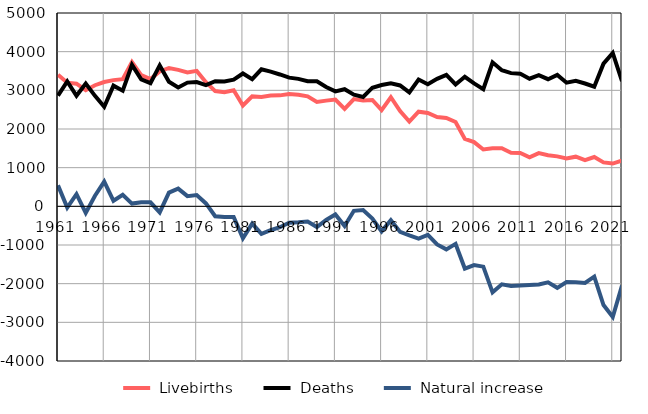
| Category |  Livebirths |  Deaths |  Natural increase |
|---|---|---|---|
| 1961.0 | 3402 | 2860 | 542 |
| 1962.0 | 3198 | 3229 | -31 |
| 1963.0 | 3173 | 2860 | 313 |
| 1964.0 | 3004 | 3173 | -169 |
| 1965.0 | 3132 | 2857 | 275 |
| 1966.0 | 3215 | 2575 | 640 |
| 1967.0 | 3264 | 3121 | 143 |
| 1968.0 | 3289 | 2992 | 297 |
| 1969.0 | 3730 | 3659 | 71 |
| 1970.0 | 3394 | 3286 | 108 |
| 1971.0 | 3290 | 3187 | 103 |
| 1972.0 | 3489 | 3645 | -156 |
| 1973.0 | 3578 | 3222 | 356 |
| 1974.0 | 3529 | 3072 | 457 |
| 1975.0 | 3464 | 3200 | 264 |
| 1976.0 | 3503 | 3213 | 290 |
| 1977.0 | 3211 | 3136 | 75 |
| 1978.0 | 2980 | 3236 | -256 |
| 1979.0 | 2953 | 3229 | -276 |
| 1980.0 | 3002 | 3276 | -274 |
| 1981.0 | 2609 | 3436 | -827 |
| 1982.0 | 2843 | 3289 | -446 |
| 1983.0 | 2830 | 3544 | -714 |
| 1984.0 | 2866 | 3484 | -618 |
| 1985.0 | 2870 | 3410 | -540 |
| 1986.0 | 2905 | 3328 | -423 |
| 1987.0 | 2885 | 3296 | -411 |
| 1988.0 | 2846 | 3237 | -391 |
| 1989.0 | 2698 | 3233 | -535 |
| 1990.0 | 2734 | 3085 | -351 |
| 1991.0 | 2762 | 2972 | -210 |
| 1992.0 | 2521 | 3028 | -507 |
| 1993.0 | 2774 | 2889 | -115 |
| 1994.0 | 2735 | 2829 | -94 |
| 1995.0 | 2750 | 3068 | -318 |
| 1996.0 | 2489 | 3137 | -648 |
| 1997.0 | 2822 | 3180 | -358 |
| 1998.0 | 2464 | 3126 | -662 |
| 1999.0 | 2193 | 2945 | -752 |
| 2000.0 | 2447 | 3280 | -833 |
| 2001.0 | 2416 | 3156 | -740 |
| 2002.0 | 2311 | 3296 | -985 |
| 2003.0 | 2287 | 3400 | -1113 |
| 2004.0 | 2181 | 3152 | -971 |
| 2005.0 | 1742 | 3351 | -1609 |
| 2006.0 | 1660 | 3178 | -1518 |
| 2007.0 | 1470 | 3030 | -1560 |
| 2008.0 | 1499 | 3724 | -2225 |
| 2009.0 | 1501 | 3519 | -2018 |
| 2010.0 | 1385 | 3445 | -2060 |
| 2011.0 | 1378 | 3428 | -2050 |
| 2012.0 | 1266 | 3301 | -2035 |
| 2013.0 | 1375 | 3395 | -2020 |
| 2014.0 | 1321 | 3288 | -1967 |
| 2015.0 | 1292 | 3400 | -2108 |
| 2016.0 | 1237 | 3197 | -1960 |
| 2017.0 | 1284 | 3245 | -1961 |
| 2018.0 | 1195 | 3176 | -1981 |
| 2019.0 | 1275 | 3093 | -1818 |
| 2020.0 | 1137 | 3690 | -2553 |
| 2021.0 | 1107 | 3968 | -2861 |
| 2022.0 | 1186 | 3235 | -2049 |